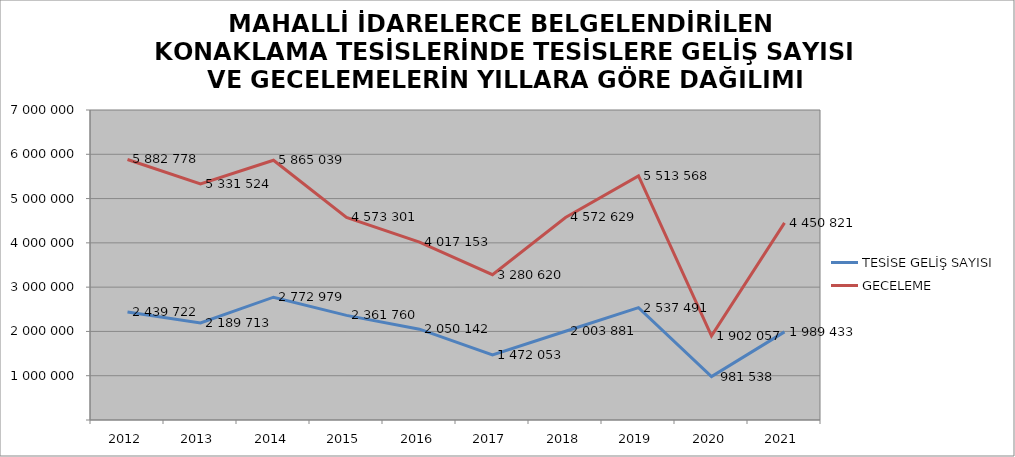
| Category | TESİSE GELİŞ SAYISI | GECELEME |
|---|---|---|
| 2012 | 2439722 | 5882778 |
| 2013 | 2189713 | 5331524 |
| 2014 | 2772979 | 5865039 |
| 2015 | 2361760 | 4573301 |
| 2016 | 2050142 | 4017153 |
| 2017 | 1472053 | 3280620 |
| 2018 | 2003881 | 4572629 |
| 2019 | 2537491 | 5513568 |
| 2020 | 981538 | 1902057 |
| 2021 | 1989433 | 4450821 |